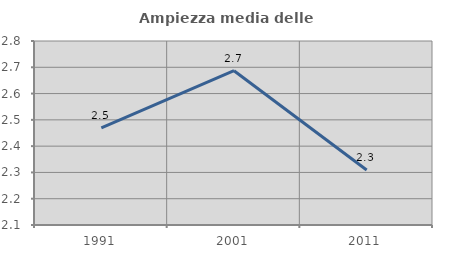
| Category | Ampiezza media delle famiglie |
|---|---|
| 1991.0 | 2.469 |
| 2001.0 | 2.687 |
| 2011.0 | 2.309 |